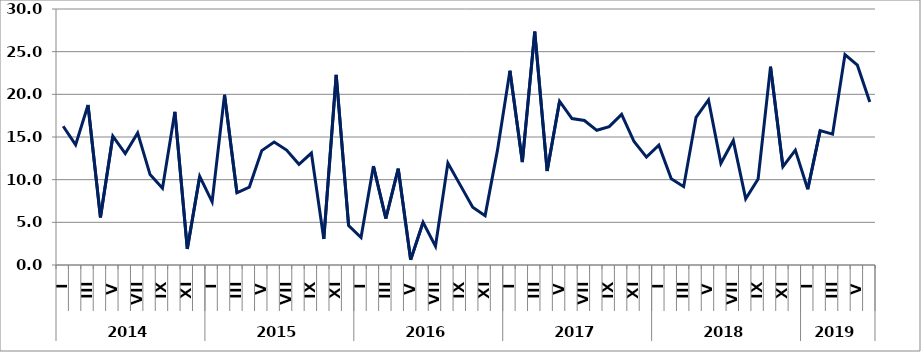
| Category | დღგ-ს  გადამხდელ  საწარმოთა  ბრუნვის ცვლილება (%) |
|---|---|
| 0 | 16.26 |
| 1 | 14.081 |
| 2 | 18.749 |
| 3 | 5.578 |
| 4 | 15.095 |
| 5 | 13.057 |
| 6 | 15.484 |
| 7 | 10.592 |
| 8 | 8.989 |
| 9 | 17.953 |
| 10 | 1.884 |
| 11 | 10.38 |
| 12 | 7.405 |
| 13 | 19.944 |
| 14 | 8.466 |
| 15 | 9.132 |
| 16 | 13.408 |
| 17 | 14.407 |
| 18 | 13.472 |
| 19 | 11.803 |
| 20 | 13.113 |
| 21 | 3.049 |
| 22 | 22.285 |
| 23 | 4.614 |
| 24 | 3.216 |
| 25 | 11.594 |
| 26 | 5.449 |
| 27 | 11.283 |
| 28 | 0.603 |
| 29 | 4.993 |
| 30 | 2.209 |
| 31 | 11.948 |
| 32 | 9.361 |
| 33 | 6.774 |
| 34 | 5.784 |
| 35 | 13.489 |
| 36 | 22.77 |
| 37 | 12.068 |
| 38 | 27.351 |
| 39 | 11.016 |
| 40 | 19.192 |
| 41 | 17.166 |
| 42 | 16.931 |
| 43 | 15.784 |
| 44 | 16.214 |
| 45 | 17.645 |
| 46 | 14.468 |
| 47 | 12.647 |
| 48 | 14.041 |
| 49 | 10.113 |
| 50 | 9.182 |
| 51 | 17.304 |
| 52 | 19.346 |
| 53 | 11.921 |
| 54 | 14.58 |
| 55 | 7.745 |
| 56 | 10.078 |
| 57 | 23.238 |
| 58 | 11.521 |
| 59 | 13.46 |
| 60 | 8.872 |
| 61 | 15.743 |
| 62 | 15.33 |
| 63 | 24.663 |
| 64 | 23.412 |
| 65 | 19.092 |